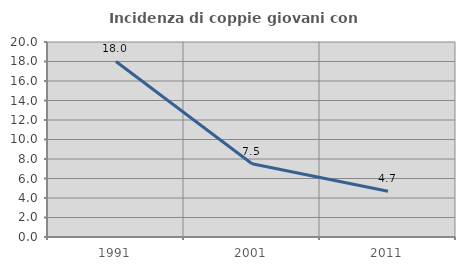
| Category | Incidenza di coppie giovani con figli |
|---|---|
| 1991.0 | 18.003 |
| 2001.0 | 7.515 |
| 2011.0 | 4.697 |